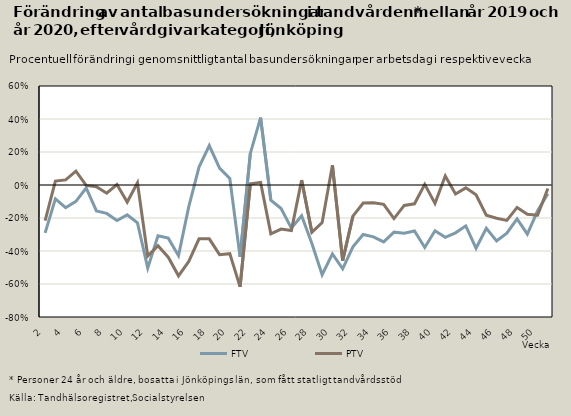
| Category | FTV | PTV |
|---|---|---|
| 2.0 | -0.29 | -0.216 |
| 3.0 | -0.084 | 0.024 |
| 4.0 | -0.137 | 0.031 |
| 5.0 | -0.099 | 0.084 |
| 6.0 | -0.018 | -0.002 |
| 7.0 | -0.157 | -0.01 |
| 8.0 | -0.172 | -0.05 |
| 9.0 | -0.215 | 0.003 |
| 10.0 | -0.181 | -0.103 |
| 11.0 | -0.229 | 0.014 |
| 12.0 | -0.504 | -0.43 |
| 13.0 | -0.307 | -0.368 |
| 14.0 | -0.322 | -0.437 |
| 15.0 | -0.428 | -0.55 |
| 16.0 | -0.132 | -0.463 |
| 17.0 | 0.108 | -0.326 |
| 18.0 | 0.238 | -0.326 |
| 19.0 | 0.102 | -0.422 |
| 20.0 | 0.039 | -0.416 |
| 21.0 | -0.436 | -0.618 |
| 22.0 | 0.191 | 0.007 |
| 23.0 | 0.408 | 0.016 |
| 24.0 | -0.092 | -0.296 |
| 25.0 | -0.143 | -0.267 |
| 26.0 | -0.261 | -0.276 |
| 27.0 | -0.187 | 0.029 |
| 28.0 | -0.354 | -0.287 |
| 29.0 | -0.543 | -0.228 |
| 30.0 | -0.418 | 0.12 |
| 31.0 | -0.508 | -0.458 |
| 32.0 | -0.374 | -0.189 |
| 33.0 | -0.3 | -0.109 |
| 34.0 | -0.314 | -0.107 |
| 35.0 | -0.345 | -0.117 |
| 36.0 | -0.286 | -0.204 |
| 37.0 | -0.292 | -0.124 |
| 38.0 | -0.279 | -0.114 |
| 39.0 | -0.378 | 0.004 |
| 40.0 | -0.277 | -0.111 |
| 41.0 | -0.317 | 0.054 |
| 42.0 | -0.29 | -0.054 |
| 43.0 | -0.248 | -0.017 |
| 44.0 | -0.383 | -0.059 |
| 45.0 | -0.263 | -0.183 |
| 46.0 | -0.338 | -0.201 |
| 47.0 | -0.291 | -0.214 |
| 48.0 | -0.205 | -0.136 |
| 49.0 | -0.297 | -0.177 |
| 50.0 | -0.156 | -0.183 |
| 51.0 | -0.053 | -0.022 |